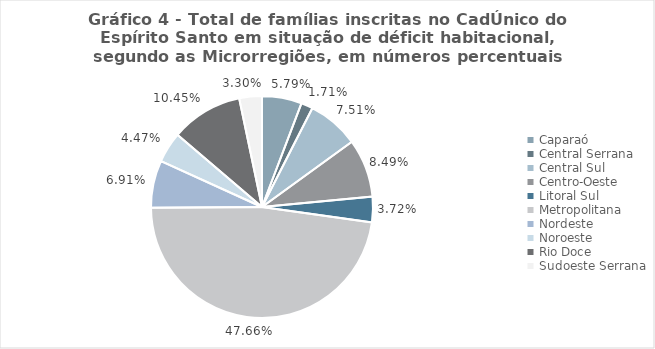
| Category | Series 0 |
|---|---|
| Caparaó | 0.058 |
| Central Serrana | 0.017 |
| Central Sul | 0.075 |
| Centro-Oeste | 0.085 |
| Litoral Sul | 0.037 |
| Metropolitana | 0.477 |
| Nordeste | 0.069 |
| Noroeste | 0.045 |
| Rio Doce | 0.105 |
| Sudoeste Serrana | 0.033 |